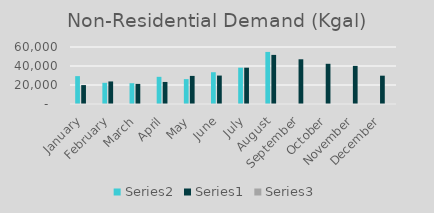
| Category | Series 1 | Series 0 | Series 2 |
|---|---|---|---|
| January | 29345 | 19908 | 1.474 |
| February | 22317.599 | 23745 | 0.94 |
| March | 21887.421 | 21154 | 1.035 |
| April | 28601.111 | 23203.745 | 1.233 |
| May | 26182.77 | 29574.268 | 0.885 |
| June | 33454.234 | 29931.133 | 1.118 |
| July | 38220.373 | 38220.373 | 1 |
| August | 54807.464 | 51691.008 | 1.06 |
| September | 0 | 47078.323 | 0 |
| October | 0 | 42320.849 | 0 |
| November | 0 | 40123.835 | 0 |
| December | 0 | 29804.055 | 0 |